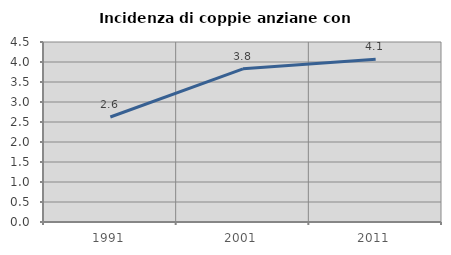
| Category | Incidenza di coppie anziane con figli |
|---|---|
| 1991.0 | 2.626 |
| 2001.0 | 3.829 |
| 2011.0 | 4.071 |